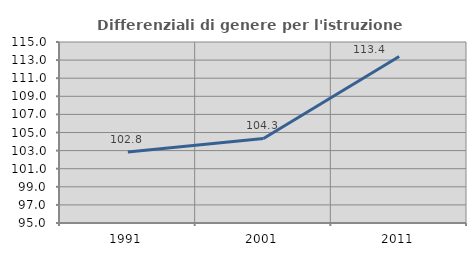
| Category | Differenziali di genere per l'istruzione superiore |
|---|---|
| 1991.0 | 102.842 |
| 2001.0 | 104.338 |
| 2011.0 | 113.406 |